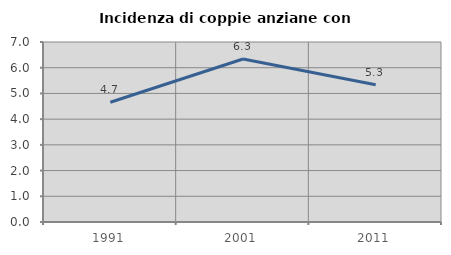
| Category | Incidenza di coppie anziane con figli |
|---|---|
| 1991.0 | 4.655 |
| 2001.0 | 6.339 |
| 2011.0 | 5.34 |